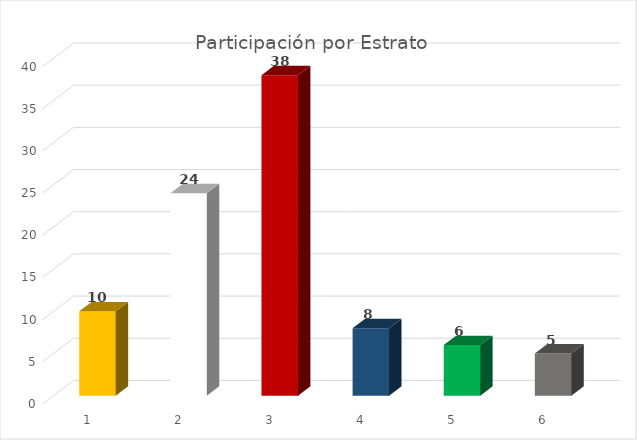
| Category | Peticiones |
|---|---|
| 0 | 10 |
| 1 | 24 |
| 2 | 38 |
| 3 | 8 |
| 4 | 6 |
| 5 | 5 |